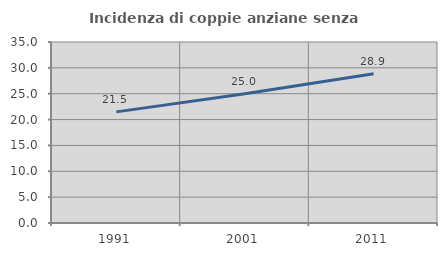
| Category | Incidenza di coppie anziane senza figli  |
|---|---|
| 1991.0 | 21.488 |
| 2001.0 | 25 |
| 2011.0 | 28.866 |